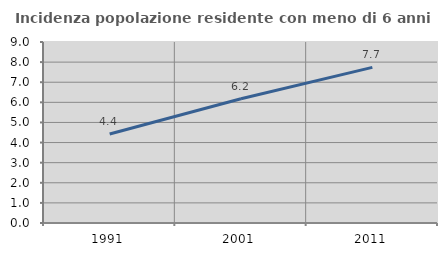
| Category | Incidenza popolazione residente con meno di 6 anni |
|---|---|
| 1991.0 | 4.428 |
| 2001.0 | 6.182 |
| 2011.0 | 7.74 |